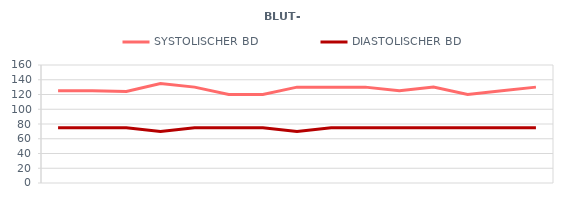
| Category | SYSTOLISCHER BD | DIASTOLISCHER BD |
|---|---|---|
| 6/1/12 | 125 | 75 |
| 6/2/12 | 125 | 75 |
| 6/3/12 | 124 | 75 |
| 6/4/12 | 135 | 70 |
| 6/5/12 | 130 | 75 |
| 6/6/12 | 120 | 75 |
| 6/7/12 | 120 | 75 |
| 6/8/12 | 130 | 70 |
| 6/9/12 | 130 | 75 |
| 6/10/12 | 130 | 75 |
| 6/11/12 | 125 | 75 |
| 6/12/12 | 130 | 75 |
| 6/13/12 | 120 | 75 |
| 6/14/12 | 125 | 75 |
| 6/15/12 | 130 | 75 |